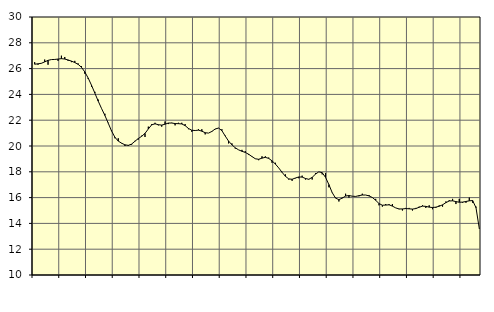
| Category | Piggar | Tillverkning o utvinning, energi o miljö, SNI 05-33, 35-39 |
|---|---|---|
| nan | 26.5 | 26.34 |
| 87.0 | 26.3 | 26.37 |
| 87.0 | 26.4 | 26.41 |
| 87.0 | 26.7 | 26.52 |
| nan | 26.3 | 26.64 |
| 88.0 | 26.7 | 26.7 |
| 88.0 | 26.7 | 26.71 |
| 88.0 | 26.6 | 26.74 |
| nan | 27 | 26.77 |
| 89.0 | 26.9 | 26.74 |
| 89.0 | 26.6 | 26.67 |
| 89.0 | 26.5 | 26.58 |
| nan | 26.6 | 26.47 |
| 90.0 | 26.4 | 26.33 |
| 90.0 | 26.2 | 26.1 |
| 90.0 | 25.6 | 25.74 |
| nan | 25.2 | 25.27 |
| 91.0 | 24.6 | 24.71 |
| 91.0 | 24.2 | 24.1 |
| 91.0 | 23.6 | 23.48 |
| nan | 22.9 | 22.91 |
| 92.0 | 22.5 | 22.37 |
| 92.0 | 21.8 | 21.77 |
| 92.0 | 21.2 | 21.16 |
| nan | 20.6 | 20.68 |
| 93.0 | 20.6 | 20.38 |
| 93.0 | 20.2 | 20.22 |
| 93.0 | 20 | 20.09 |
| nan | 20 | 20.05 |
| 94.0 | 20.1 | 20.15 |
| 94.0 | 20.4 | 20.37 |
| 94.0 | 20.5 | 20.58 |
| nan | 20.8 | 20.75 |
| 95.0 | 20.7 | 20.98 |
| 95.0 | 21.5 | 21.32 |
| 95.0 | 21.7 | 21.64 |
| nan | 21.8 | 21.72 |
| 96.0 | 21.6 | 21.65 |
| 96.0 | 21.5 | 21.62 |
| 96.0 | 21.9 | 21.69 |
| nan | 21.7 | 21.78 |
| 97.0 | 21.8 | 21.78 |
| 97.0 | 21.6 | 21.74 |
| 97.0 | 21.8 | 21.73 |
| nan | 21.8 | 21.71 |
| 98.0 | 21.7 | 21.58 |
| 98.0 | 21.3 | 21.36 |
| 98.0 | 21.1 | 21.22 |
| nan | 21.2 | 21.2 |
| 99.0 | 21.3 | 21.23 |
| 99.0 | 21.3 | 21.15 |
| 99.0 | 20.9 | 21.03 |
| nan | 21 | 21 |
| 0.0 | 21.1 | 21.13 |
| 0.0 | 21.3 | 21.32 |
| 0.0 | 21.4 | 21.39 |
| nan | 21.3 | 21.19 |
| 1.0 | 20.8 | 20.77 |
| 1.0 | 20.2 | 20.38 |
| 1.0 | 20.2 | 20.09 |
| nan | 19.8 | 19.86 |
| 2.0 | 19.7 | 19.7 |
| 2.0 | 19.7 | 19.59 |
| 2.0 | 19.6 | 19.5 |
| nan | 19.3 | 19.36 |
| 3.0 | 19.2 | 19.18 |
| 3.0 | 19 | 19.01 |
| 3.0 | 18.9 | 18.97 |
| nan | 19.2 | 19.06 |
| 4.0 | 19.2 | 19.12 |
| 4.0 | 19.1 | 19.04 |
| 4.0 | 18.7 | 18.85 |
| nan | 18.7 | 18.6 |
| 5.0 | 18.3 | 18.3 |
| 5.0 | 18 | 17.96 |
| 5.0 | 17.8 | 17.65 |
| nan | 17.4 | 17.45 |
| 6.0 | 17.3 | 17.42 |
| 6.0 | 17.5 | 17.52 |
| 6.0 | 17.5 | 17.6 |
| nan | 17.7 | 17.59 |
| 7.0 | 17.4 | 17.48 |
| 7.0 | 17.4 | 17.42 |
| 7.0 | 17.4 | 17.57 |
| nan | 17.9 | 17.82 |
| 8.0 | 18 | 18 |
| 8.0 | 17.8 | 17.93 |
| 8.0 | 17.9 | 17.57 |
| nan | 16.8 | 17.01 |
| 9.0 | 16.4 | 16.38 |
| 9.0 | 16 | 15.96 |
| 9.0 | 15.7 | 15.84 |
| nan | 16 | 15.96 |
| 10.0 | 16.3 | 16.12 |
| 10.0 | 16 | 16.16 |
| 10.0 | 16.1 | 16.11 |
| nan | 16.1 | 16.09 |
| 11.0 | 16.1 | 16.15 |
| 11.0 | 16.3 | 16.2 |
| 11.0 | 16.2 | 16.2 |
| nan | 16.2 | 16.13 |
| 12.0 | 16 | 16.01 |
| 12.0 | 15.9 | 15.79 |
| 12.0 | 15.4 | 15.54 |
| nan | 15.3 | 15.41 |
| 13.0 | 15.5 | 15.42 |
| 13.0 | 15.5 | 15.44 |
| 13.0 | 15.5 | 15.34 |
| nan | 15.2 | 15.2 |
| 14.0 | 15.1 | 15.12 |
| 14.0 | 15 | 15.12 |
| 14.0 | 15.2 | 15.15 |
| nan | 15.2 | 15.13 |
| 15.0 | 15 | 15.11 |
| 15.0 | 15.2 | 15.15 |
| 15.0 | 15.3 | 15.25 |
| nan | 15.4 | 15.34 |
| 16.0 | 15.2 | 15.32 |
| 16.0 | 15.4 | 15.26 |
| 16.0 | 15.1 | 15.23 |
| nan | 15.2 | 15.26 |
| 17.0 | 15.4 | 15.33 |
| 17.0 | 15.3 | 15.44 |
| 17.0 | 15.7 | 15.61 |
| nan | 15.8 | 15.74 |
| 18.0 | 15.9 | 15.75 |
| 18.0 | 15.5 | 15.69 |
| 18.0 | 15.9 | 15.64 |
| nan | 15.6 | 15.65 |
| 19.0 | 15.6 | 15.7 |
| 19.0 | 16 | 15.75 |
| 19.0 | 15.6 | 15.77 |
| nan | 15.3 | 15.22 |
| 20.0 | 13.6 | 13.58 |